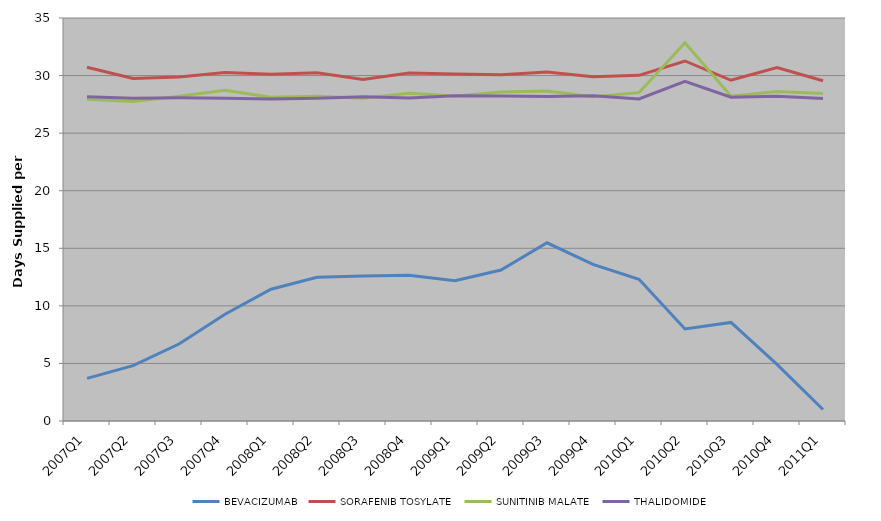
| Category | BEVACIZUMAB | SORAFENIB TOSYLATE | SUNITINIB MALATE | THALIDOMIDE |
|---|---|---|---|---|
| 2007Q1 | 3.698 | 30.722 | 27.945 | 28.163 |
| 2007Q2 | 4.802 | 29.741 | 27.754 | 28.034 |
| 2007Q3 | 6.685 | 29.883 | 28.199 | 28.066 |
| 2007Q4 | 9.272 | 30.273 | 28.726 | 28.025 |
| 2008Q1 | 11.444 | 30.119 | 28.127 | 27.972 |
| 2008Q2 | 12.489 | 30.249 | 28.196 | 28.027 |
| 2008Q3 | 12.595 | 29.66 | 28.024 | 28.161 |
| 2008Q4 | 12.661 | 30.218 | 28.47 | 28.044 |
| 2009Q1 | 12.179 | 30.133 | 28.235 | 28.246 |
| 2009Q2 | 13.111 | 30.074 | 28.577 | 28.223 |
| 2009Q3 | 15.475 | 30.309 | 28.656 | 28.187 |
| 2009Q4 | 13.608 | 29.896 | 28.164 | 28.247 |
| 2010Q1 | 12.305 | 30.023 | 28.515 | 27.972 |
| 2010Q2 | 7.995 | 31.267 | 32.842 | 29.495 |
| 2010Q3 | 8.562 | 29.592 | 28.212 | 28.114 |
| 2010Q4 | 4.916 | 30.706 | 28.611 | 28.209 |
| 2011Q1 | 1 | 29.545 | 28.435 | 28 |